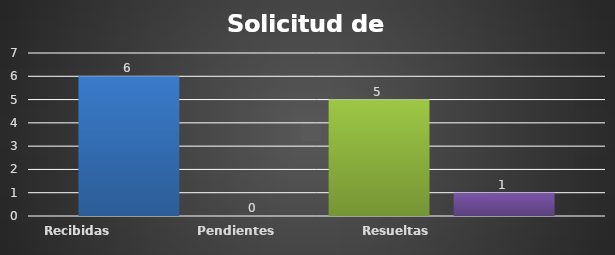
| Category | Recibidas  | Pendientes  | Resueltas | Rechazadas  |
|---|---|---|---|---|
| Recibidas  | 6 | 0 | 5 | 1 |